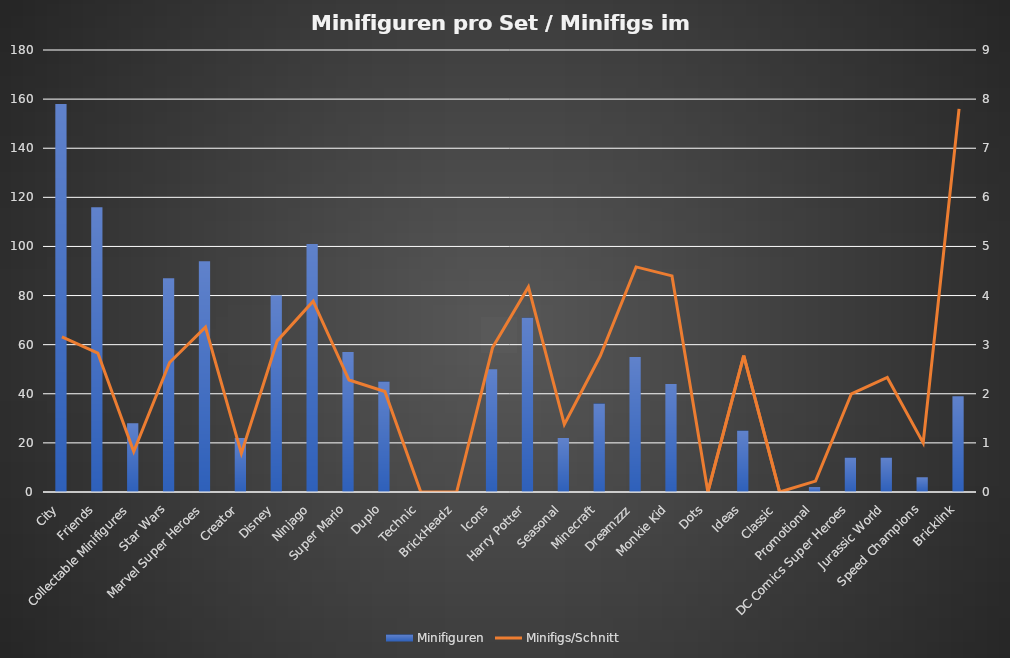
| Category | Minifiguren |
|---|---|
| City | 158 |
| Friends | 116 |
| Collectable Minifigures | 28 |
| Star Wars | 87 |
| Marvel Super Heroes | 94 |
| Creator | 22 |
| Disney | 80 |
| Ninjago | 101 |
| Super Mario | 57 |
| Duplo | 45 |
| Technic | 0 |
| BrickHeadz | 0 |
| Icons | 50 |
| Harry Potter | 71 |
| Seasonal | 22 |
| Minecraft | 36 |
| Dreamzzz | 55 |
| Monkie Kid | 44 |
| Dots | 0 |
| Ideas | 25 |
| Classic | 0 |
| Promotional | 2 |
| DC Comics Super Heroes | 14 |
| Jurassic World | 14 |
| Speed Champions | 6 |
| Bricklink | 39 |